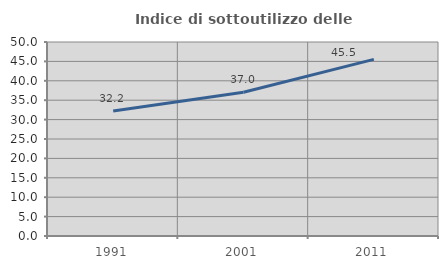
| Category | Indice di sottoutilizzo delle abitazioni  |
|---|---|
| 1991.0 | 32.222 |
| 2001.0 | 37.037 |
| 2011.0 | 45.531 |